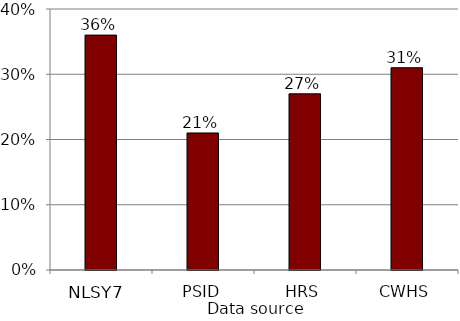
| Category | Series 0 |
|---|---|
| NLSY79 | 0.36 |
| PSID | 0.21 |
| HRS | 0.27 |
| CWHS | 0.31 |